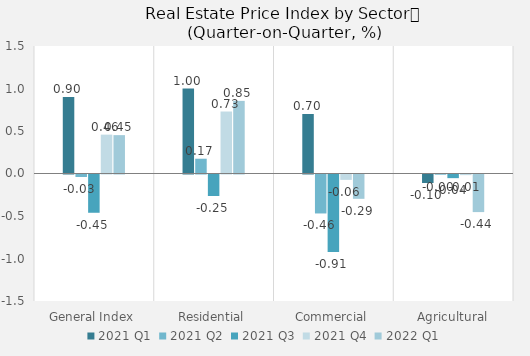
| Category | 2021 | 2022 |
|---|---|---|
| General Index | 0.457 | 0.451 |
| Residential | 0.729 | 0.854 |
| Commercial | -0.063 | -0.286 |
| Agricultural | -0.008 | -0.442 |